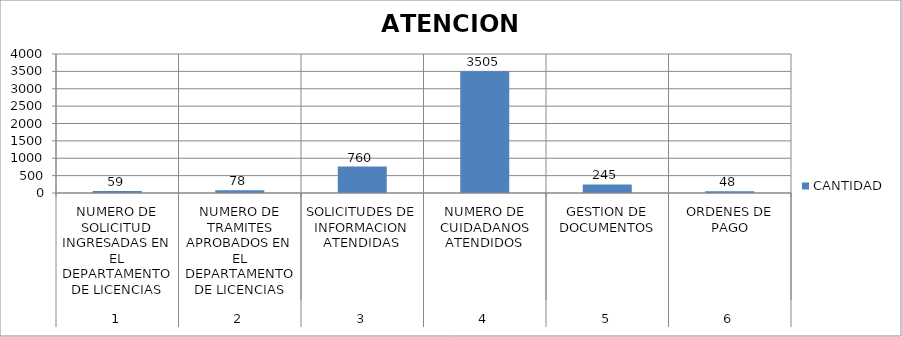
| Category | CANTIDAD |
|---|---|
| 0 | 59 |
| 1 | 78 |
| 2 | 760 |
| 3 | 3505 |
| 4 | 245 |
| 5 | 48 |